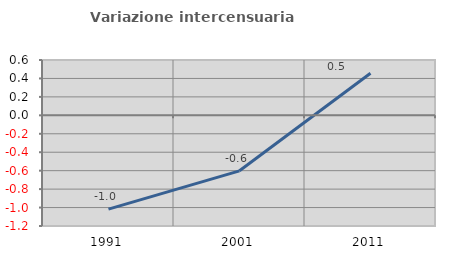
| Category | Variazione intercensuaria annua |
|---|---|
| 1991.0 | -1.017 |
| 2001.0 | -0.602 |
| 2011.0 | 0.456 |